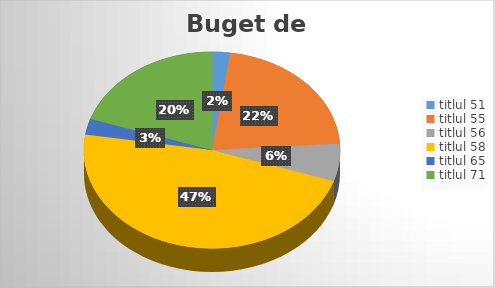
| Category | Series 0 |
|---|---|
| titlul 51 | 42226 |
| titlul 55 | 404999 |
| titlul 56 | 115647 |
| titlul 58 | 886597 |
| titlul 65 | 48339 |
| titlul 71 | 371624 |